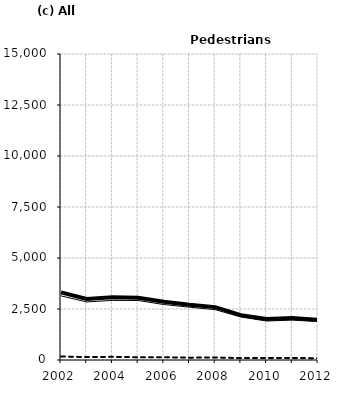
| Category | Built-up | Non built-up | Total |
|---|---|---|---|
| 2002.0 | 3144 | 172 | 3316 |
| 2003.0 | 2847 | 143 | 2990 |
| 2004.0 | 2921 | 157 | 3078 |
| 2005.0 | 2918 | 133 | 3051 |
| 2006.0 | 2719 | 134 | 2853 |
| 2007.0 | 2589 | 115 | 2704 |
| 2008.0 | 2469 | 124 | 2593 |
| 2009.0 | 2107 | 92 | 2199 |
| 2010.0 | 1911 | 102 | 2013 |
| 2011.0 | 1957 | 103 | 2060 |
| 2012.0 | 1884 | 85 | 1969 |